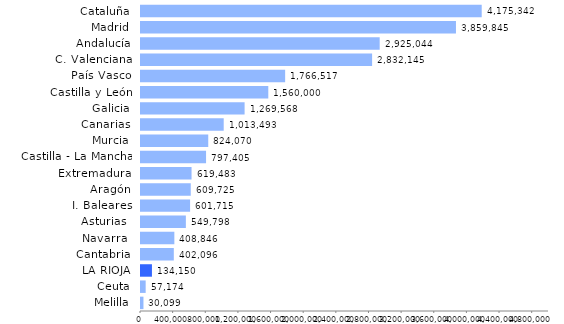
| Category | Series 0 |
|---|---|
| Melilla | 30098.536 |
| Ceuta | 57174.204 |
| LA RIOJA | 134149.653 |
| Cantabria | 402096.255 |
| Navarra  | 408846.211 |
| Asturias  | 549798.252 |
| I. Baleares | 601715.403 |
| Aragón | 609725.289 |
| Extremadura | 619482.543 |
| Castilla - La Mancha | 797405.04 |
| Murcia | 824070.191 |
| Canarias | 1013492.729 |
| Galicia | 1269568.452 |
| Castilla y León | 1560000.253 |
| País Vasco | 1766516.54 |
| C. Valenciana | 2832145.234 |
| Andalucía | 2925043.673 |
| Madrid | 3859844.937 |
| Cataluña | 4175342.21 |